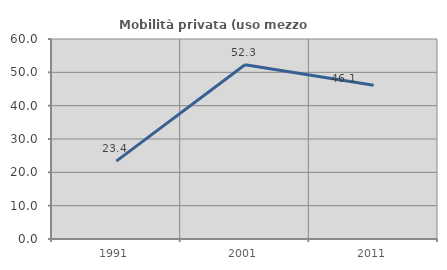
| Category | Mobilità privata (uso mezzo privato) |
|---|---|
| 1991.0 | 23.361 |
| 2001.0 | 52.285 |
| 2011.0 | 46.141 |